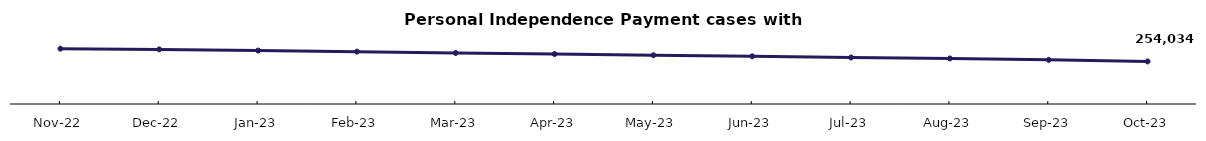
| Category | Series 0 |
|---|---|
| Nov-22 | 330377 |
| Dec-22 | 326063 |
| Jan-23 | 319221 |
| Feb-23 | 312481 |
| Mar-23 | 304710 |
| Apr-23 | 298264 |
| May-23 | 291066 |
| Jun-23 | 284679 |
| Jul-23 | 277722 |
| Aug-23 | 272014 |
| Sep-23 | 263487 |
| Oct-23 | 254034 |